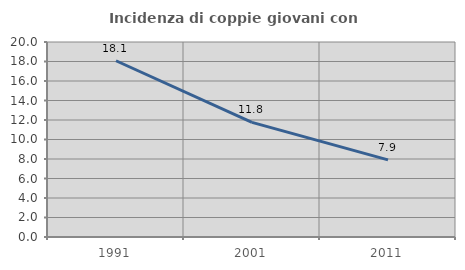
| Category | Incidenza di coppie giovani con figli |
|---|---|
| 1991.0 | 18.078 |
| 2001.0 | 11.752 |
| 2011.0 | 7.91 |